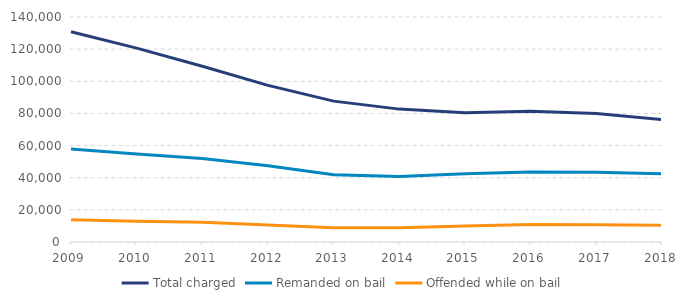
| Category | Total charged | Remanded on bail | Offended while on bail |
|---|---|---|---|
| 2009.0 | 130846 | 57866 | 13847 |
| 2010.0 | 120636 | 54769 | 12937 |
| 2011.0 | 109366 | 51924 | 12244 |
| 2012.0 | 97431 | 47382 | 10589 |
| 2013.0 | 87656 | 41813 | 8907 |
| 2014.0 | 82684 | 40823 | 8921 |
| 2015.0 | 80383 | 42506 | 9984 |
| 2016.0 | 81318 | 43539 | 10915 |
| 2017.0 | 79981 | 43387 | 10798 |
| 2018.0 | 76190 | 42520 | 10488 |